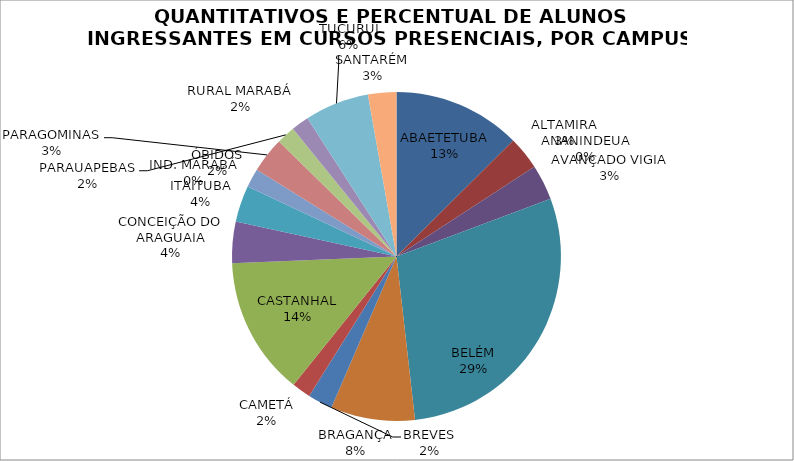
| Category | QUANTITATIVOS E PERCENTUAL DE ALUNOS INGRESSANTES EM CURSOS PRESENCIAIS, POR CAMPUS, NO ANO LETIVO DE 2015. |
|---|---|
| ABAETETUBA | 12.555 |
| ALTAMIRA | 3.266 |
| ANANINDEUA | 0 |
| AVANÇADO VIGIA | 3.475 |
| BELÉM | 28.909 |
| BRAGANÇA | 8.27 |
| BREVES | 2.432 |
| CAMETÁ | 1.853 |
| CASTANHAL | 13.597 |
| CONCEIÇÃO DO ARAGUAIA | 4.054 |
| ITAITUBA | 3.59 |
| IND. MARABÁ | 0 |
| ÓBIDOS | 1.853 |
| PARAGOMINAS | 3.475 |
| PARAUAPEBAS | 1.83 |
| RURAL MARABÁ | 1.737 |
| TUCURUÍ | 6.324 |
| SANTARÉM | 2.78 |